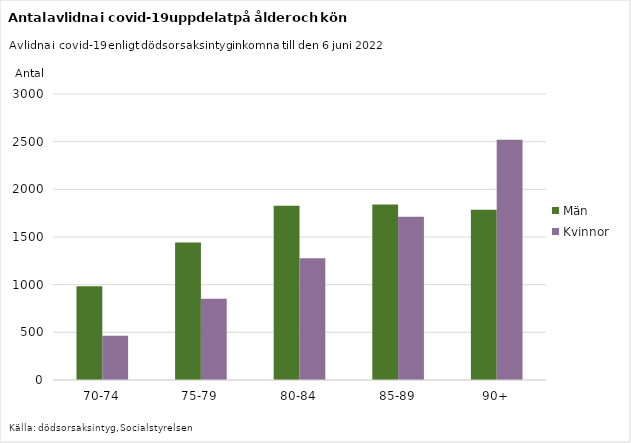
| Category | Män | Kvinnor |
|---|---|---|
| 70-74 | 983 | 464 |
| 75-79 | 1442 | 851 |
| 80-84 | 1827 | 1277 |
| 85-89 | 1842 | 1712 |
| 90+ | 1786 | 2519 |